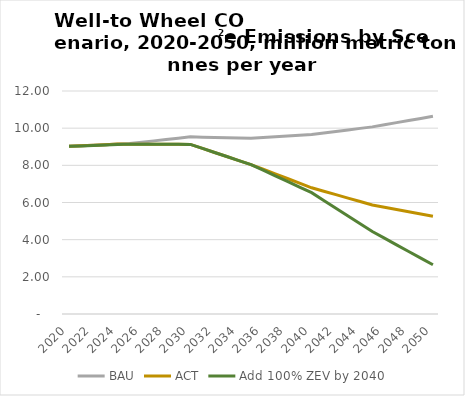
| Category | BAU | ACT | Add 100% ZEV by 2040 |
|---|---|---|---|
| 2020.0 | 9.023 | 9.023 | 9.023 |
| 2021.0 | 9.052 | 9.052 | 9.046 |
| 2022.0 | 9.082 | 9.082 | 9.07 |
| 2023.0 | 9.112 | 9.112 | 9.094 |
| 2024.0 | 9.141 | 9.141 | 9.118 |
| 2025.0 | 9.171 | 9.141 | 9.141 |
| 2026.0 | 9.244 | 9.138 | 9.138 |
| 2027.0 | 9.316 | 9.135 | 9.135 |
| 2028.0 | 9.389 | 9.132 | 9.132 |
| 2029.0 | 9.462 | 9.129 | 9.129 |
| 2030.0 | 9.534 | 9.126 | 9.126 |
| 2031.0 | 9.518 | 8.909 | 8.909 |
| 2032.0 | 9.502 | 8.691 | 8.691 |
| 2033.0 | 9.485 | 8.474 | 8.474 |
| 2034.0 | 9.469 | 8.256 | 8.256 |
| 2035.0 | 9.453 | 8.038 | 8.038 |
| 2036.0 | 9.495 | 7.789 | 7.737 |
| 2037.0 | 9.537 | 7.54 | 7.435 |
| 2038.0 | 9.579 | 7.29 | 7.133 |
| 2039.0 | 9.621 | 7.041 | 6.831 |
| 2040.0 | 9.663 | 6.791 | 6.529 |
| 2041.0 | 9.744 | 6.606 | 6.111 |
| 2042.0 | 9.826 | 6.421 | 5.692 |
| 2043.0 | 9.907 | 6.236 | 5.274 |
| 2044.0 | 9.988 | 6.05 | 4.855 |
| 2045.0 | 10.07 | 5.865 | 4.437 |
| 2046.0 | 10.184 | 5.744 | 4.08 |
| 2047.0 | 10.298 | 5.624 | 3.723 |
| 2048.0 | 10.412 | 5.503 | 3.366 |
| 2049.0 | 10.526 | 5.382 | 3.008 |
| 2050.0 | 10.639 | 5.261 | 2.651 |